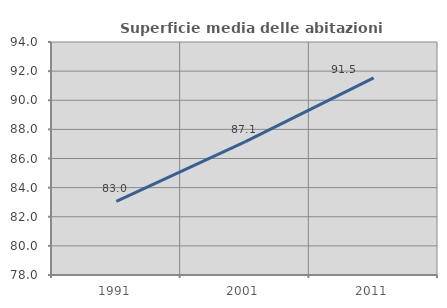
| Category | Superficie media delle abitazioni occupate |
|---|---|
| 1991.0 | 83.05 |
| 2001.0 | 87.136 |
| 2011.0 | 91.54 |